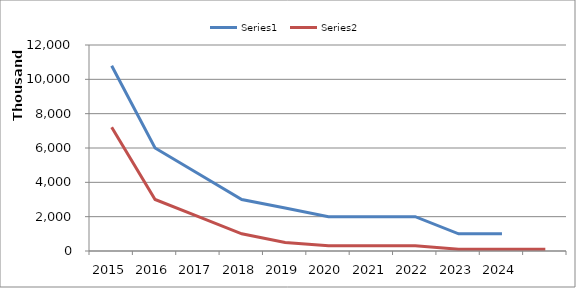
| Category | Series 0 | Series 1 |
|---|---|---|
| 2015.0 | 10787578 | 7208000 |
| 2016.0 | 6000000 | 3000000 |
| 2017.0 | 4500000 | 2000000 |
| 2018.0 | 3000000 | 1000000 |
| 2019.0 | 2500000 | 500000 |
| 2020.0 | 2000000 | 300000 |
| 2021.0 | 2000000 | 300000 |
| 2022.0 | 2000000 | 300000 |
| 2023.0 | 1000000 | 100000 |
| 2024.0 | 1000000 | 100000 |